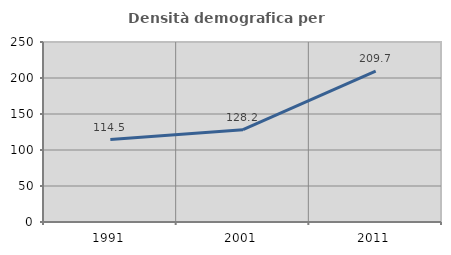
| Category | Densità demografica |
|---|---|
| 1991.0 | 114.509 |
| 2001.0 | 128.161 |
| 2011.0 | 209.707 |